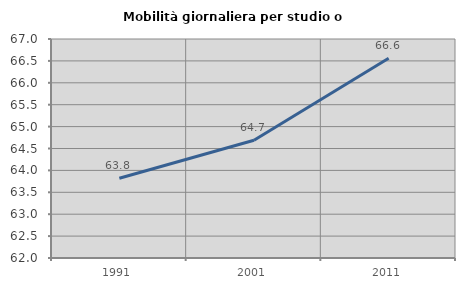
| Category | Mobilità giornaliera per studio o lavoro |
|---|---|
| 1991.0 | 63.821 |
| 2001.0 | 64.687 |
| 2011.0 | 66.562 |